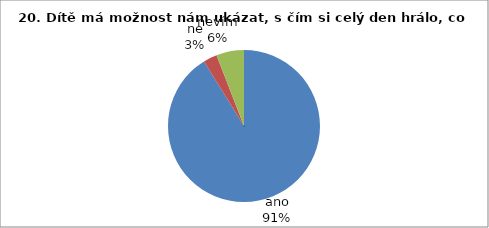
| Category | 20. |
|---|---|
| ano | 31 |
| ne | 1 |
| nevím | 2 |